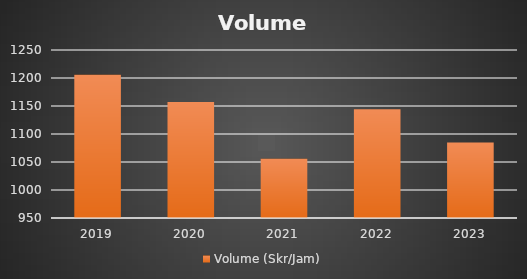
| Category | Volume (Skr/Jam) |
|---|---|
| 2019.0 | 1205.688 |
| 2020.0 | 1157.342 |
| 2021.0 | 1055.952 |
| 2022.0 | 1144.24 |
| 2023.0 | 1085.013 |